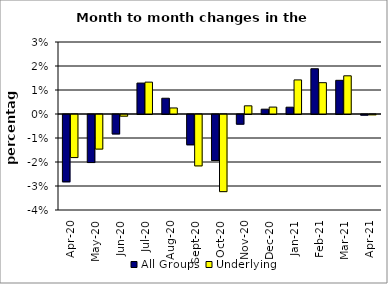
| Category | All Groups | Underlying |
|---|---|---|
| 2020-04-01 | -0.028 | -0.018 |
| 2020-05-01 | -0.02 | -0.014 |
| 2020-06-01 | -0.008 | -0.001 |
| 2020-07-01 | 0.013 | 0.013 |
| 2020-08-01 | 0.007 | 0.003 |
| 2020-09-01 | -0.013 | -0.021 |
| 2020-10-01 | -0.019 | -0.032 |
| 2020-11-01 | -0.004 | 0.003 |
| 2020-12-01 | 0.002 | 0.003 |
| 2021-01-01 | 0.003 | 0.014 |
| 2021-02-01 | 0.019 | 0.013 |
| 2021-03-01 | 0.014 | 0.016 |
| 2021-04-01 | 0 | 0 |